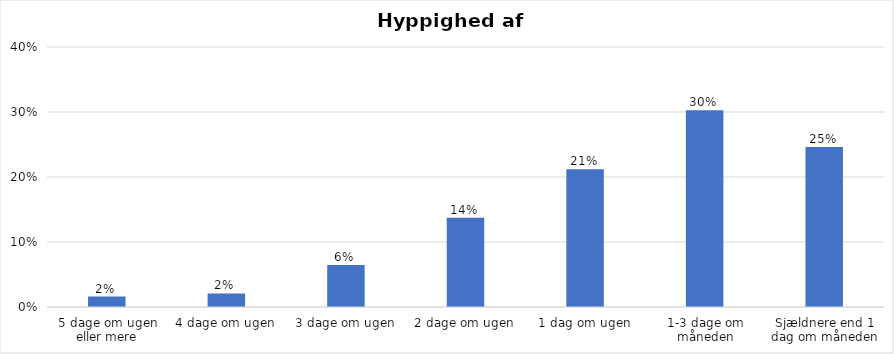
| Category | % |
|---|---|
| 5 dage om ugen eller mere | 0.016 |
| 4 dage om ugen | 0.021 |
| 3 dage om ugen | 0.065 |
| 2 dage om ugen | 0.137 |
| 1 dag om ugen | 0.212 |
| 1-3 dage om måneden | 0.303 |
| Sjældnere end 1 dag om måneden | 0.246 |